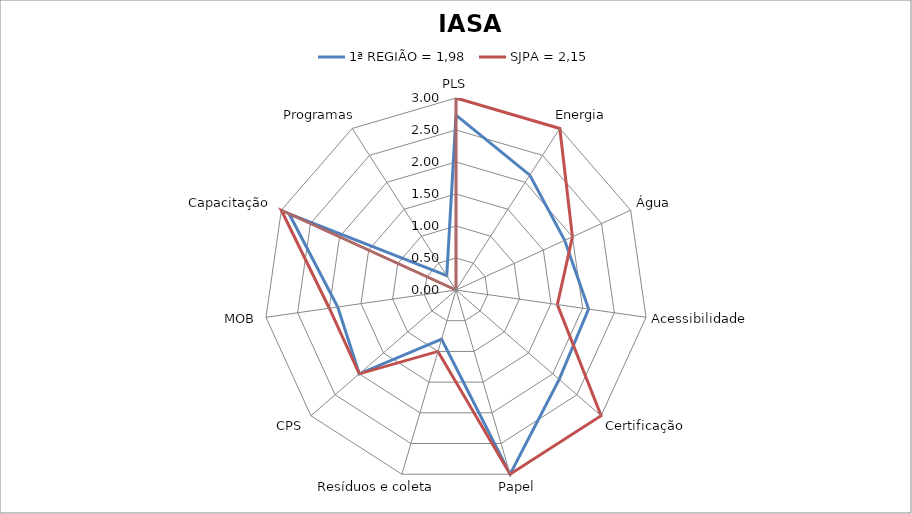
| Category | 1ª REGIÃO = 1,98 | SJPA = 2,15 |
|---|---|---|
| PLS | 2.733 | 3 |
| Energia | 2.133 | 3 |
| Água | 1.867 | 2 |
| Acessibilidade | 2.093 | 1.6 |
| Certificação | 2.133 | 3 |
| Papel | 3 | 3 |
| Resíduos e coleta | 0.8 | 1 |
| CPS | 2 | 2 |
| MOB | 1.867 | 2 |
| Capacitação | 2.867 | 3 |
| Programas | 0.267 | 0 |